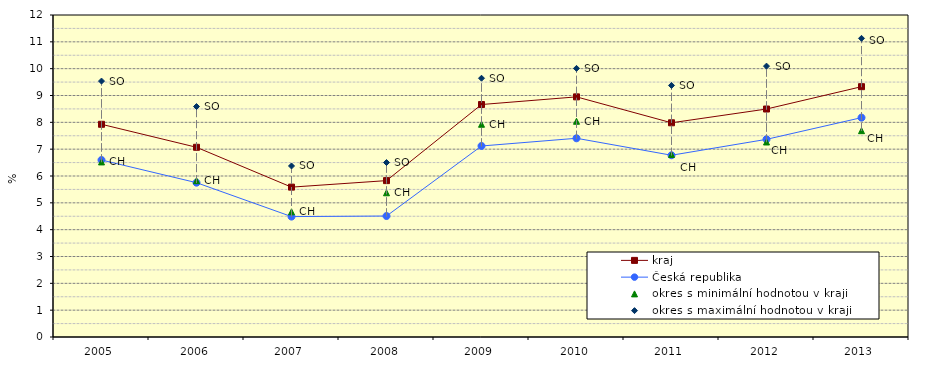
| Category | kraj | Česká republika | okres s minimální hodnotou v kraji | okres s maximální hodnotou v kraji |
|---|---|---|---|---|
| 2005.0 | 7.927 | 6.596 | 6.524 | 9.538 |
| 2006.0 | 7.07 | 5.751 | 5.826 | 8.589 |
| 2007.0 | 5.585 | 4.488 | 4.666 | 6.373 |
| 2008.0 | 5.828 | 4.508 | 5.375 | 6.502 |
| 2009.0 | 8.663 | 7.118 | 7.928 | 9.643 |
| 2010.0 | 8.949 | 7.406 | 8.04 | 10.011 |
| 2011.0 | 7.983 | 6.774 | 6.802 | 9.375 |
| 2012.0 | 8.496 | 7.367 | 7.267 | 10.095 |
| 2013.0 | 9.329 | 8.175 | 7.689 | 11.13 |